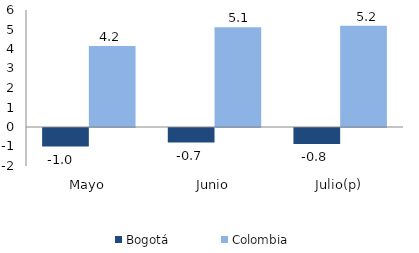
| Category | Bogotá | Colombia |
|---|---|---|
| Mayo | -0.951 | 4.152 |
| Junio | -0.745 | 5.111 |
| Julio(p) | -0.816 | 5.188 |